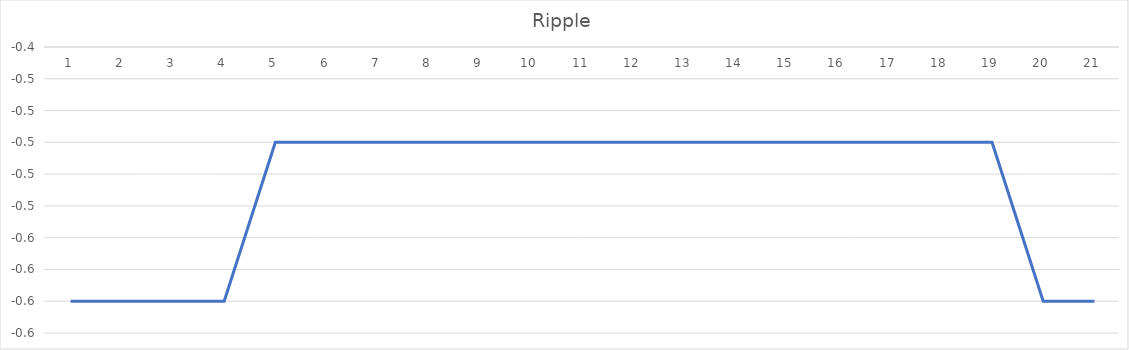
| Category | Series 0 |
|---|---|
| 0 | -0.6 |
| 1 | -0.6 |
| 2 | -0.6 |
| 3 | -0.6 |
| 4 | -0.5 |
| 5 | -0.5 |
| 6 | -0.5 |
| 7 | -0.5 |
| 8 | -0.5 |
| 9 | -0.5 |
| 10 | -0.5 |
| 11 | -0.5 |
| 12 | -0.5 |
| 13 | -0.5 |
| 14 | -0.5 |
| 15 | -0.5 |
| 16 | -0.5 |
| 17 | -0.5 |
| 18 | -0.5 |
| 19 | -0.6 |
| 20 | -0.6 |